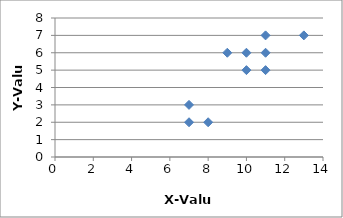
| Category | Y |
|---|---|
| 10.0 | 6 |
| 8.0 | 2 |
| 9.0 | 6 |
| 11.0 | 5 |
| 13.0 | 7 |
| 11.0 | 6 |
| 10.0 | 5 |
| 7.0 | 2 |
| 7.0 | 3 |
| 11.0 | 7 |